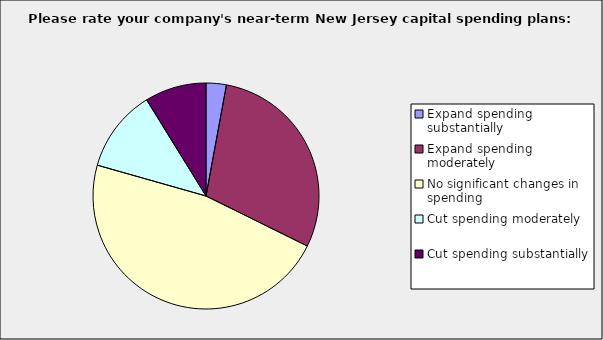
| Category | Series 0 |
|---|---|
| Expand spending substantially | 0.029 |
| Expand spending moderately | 0.294 |
| No significant changes in spending | 0.471 |
| Cut spending moderately | 0.118 |
| Cut spending substantially | 0.088 |